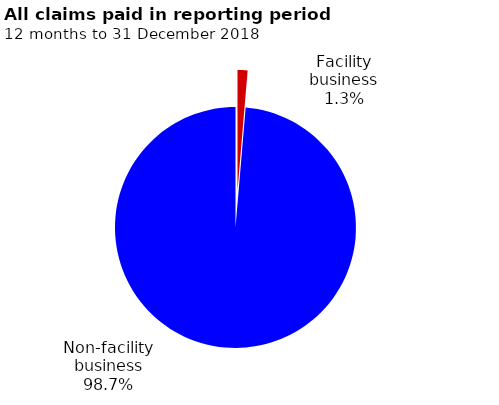
| Category | Series 0 |
|---|---|
| Facility business | 26210950 |
| Non-facility business | 1924789933 |